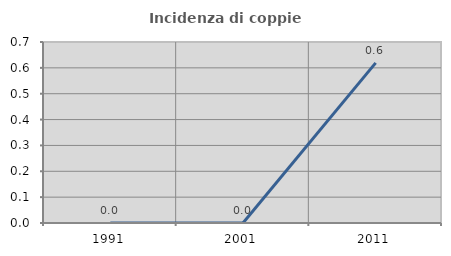
| Category | Incidenza di coppie miste |
|---|---|
| 1991.0 | 0 |
| 2001.0 | 0 |
| 2011.0 | 0.619 |